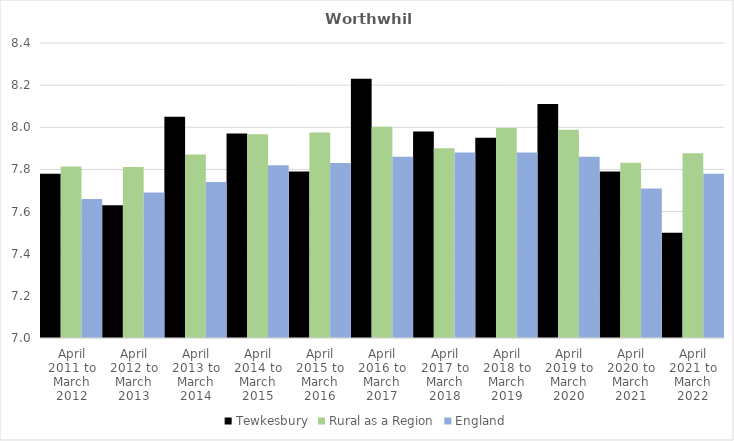
| Category | Tewkesbury | Rural as a Region | England |
|---|---|---|---|
| April 2011 to March 2012 | 7.78 | 7.813 | 7.66 |
| April 2012 to March 2013 | 7.63 | 7.811 | 7.69 |
| April 2013 to March 2014 | 8.05 | 7.871 | 7.74 |
| April 2014 to March 2015 | 7.97 | 7.967 | 7.82 |
| April 2015 to March 2016 | 7.79 | 7.975 | 7.83 |
| April 2016 to March 2017 | 8.23 | 8.002 | 7.86 |
| April 2017 to March 2018 | 7.98 | 7.9 | 7.88 |
| April 2018 to March 2019 | 7.95 | 7.996 | 7.88 |
| April 2019 to March 2020 | 8.11 | 7.988 | 7.86 |
| April 2020 to March 2021 | 7.79 | 7.831 | 7.71 |
| April 2021 to March 2022 | 7.5 | 7.877 | 7.78 |